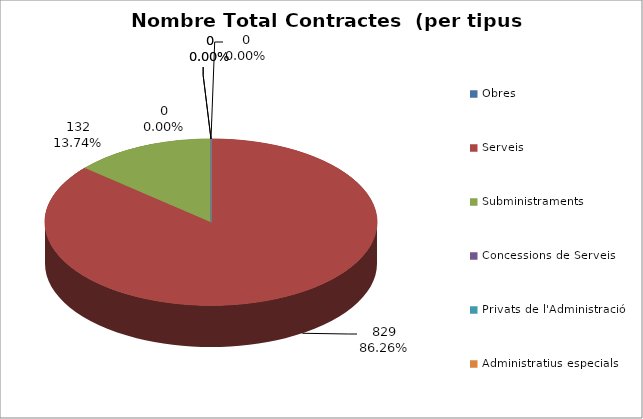
| Category | Nombre Total Contractes |
|---|---|
| Obres | 0 |
| Serveis | 829 |
| Subministraments | 132 |
| Concessions de Serveis | 0 |
| Privats de l'Administració | 0 |
| Administratius especials | 0 |